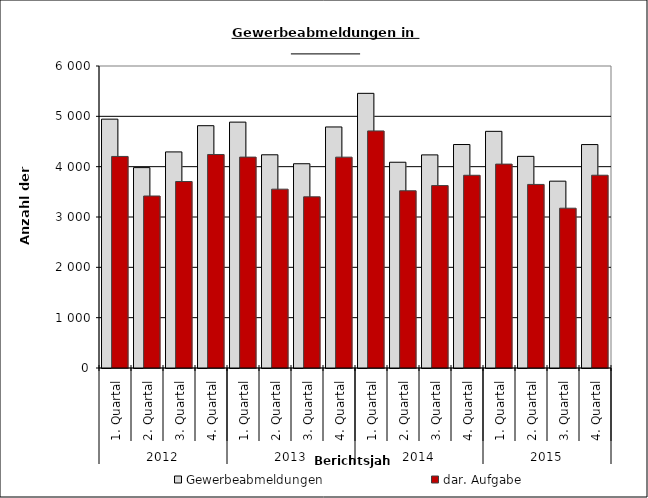
| Category | Gewerbeabmeldungen | dar. Aufgabe |
|---|---|---|
| 0 | 4944 | 4203 |
| 1 | 3981 | 3417 |
| 2 | 4293 | 3705 |
| 3 | 4814 | 4242 |
| 4 | 4885 | 4190 |
| 5 | 4236 | 3553 |
| 6 | 4058 | 3401 |
| 7 | 4789 | 4189 |
| 8 | 5457 | 4710 |
| 9 | 4088 | 3521 |
| 10 | 4234 | 3624 |
| 11 | 4440 | 3829 |
| 12 | 4702 | 4051 |
| 13 | 4205 | 3647 |
| 14 | 3712 | 3175 |
| 15 | 4439 | 3830 |